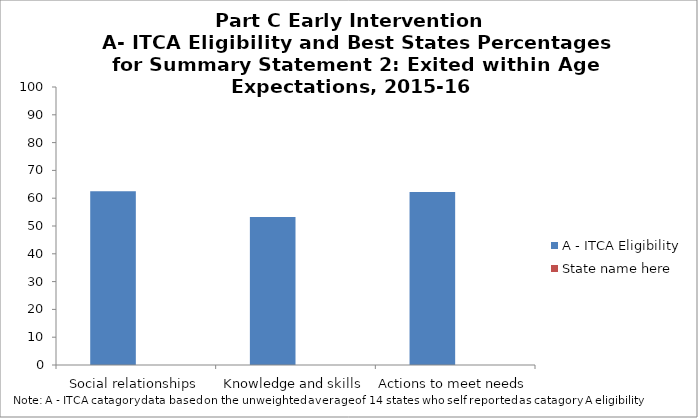
| Category | A - ITCA Eligibility | State name here |
|---|---|---|
| Social relationships | 62.5 |  |
| Knowledge and skills | 53.2 |  |
| Actions to meet needs | 62.2 |  |